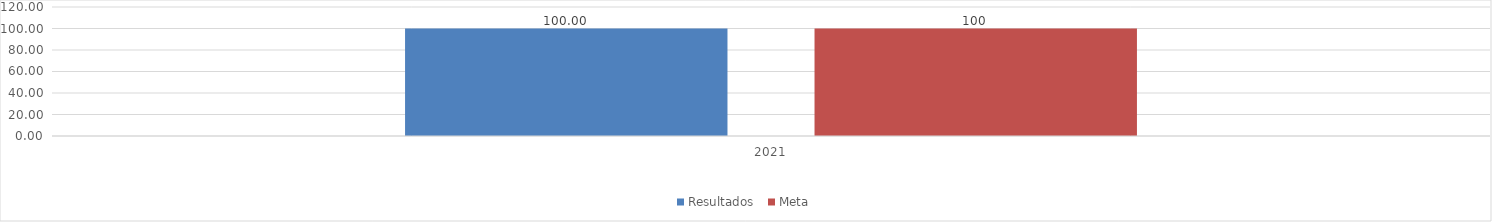
| Category | Resultados  | Meta |
|---|---|---|
| 2021 | 100 | 100 |